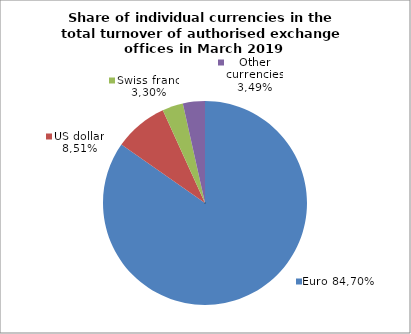
| Category | EUR |
|---|---|
| 0 | 84.7 |
| 1 | 8.514 |
| 2 | 3.296 |
| 3 | 3.49 |